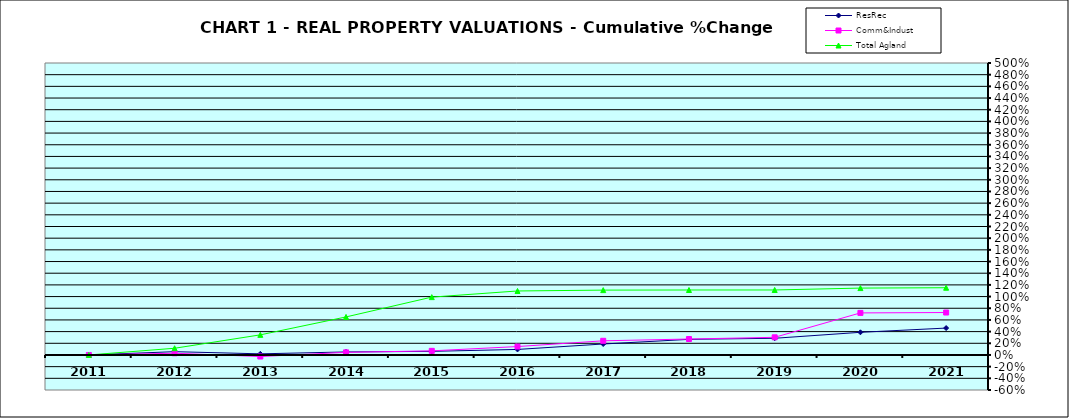
| Category | ResRec | Comm&Indust | Total Agland |
|---|---|---|---|
| 2011.0 | 0 | 0 | 0 |
| 2012.0 | 0.056 | 0.029 | 0.115 |
| 2013.0 | 0.019 | -0.027 | 0.345 |
| 2014.0 | 0.052 | 0.045 | 0.651 |
| 2015.0 | 0.062 | 0.071 | 0.991 |
| 2016.0 | 0.094 | 0.144 | 1.096 |
| 2017.0 | 0.188 | 0.242 | 1.111 |
| 2018.0 | 0.267 | 0.273 | 1.113 |
| 2019.0 | 0.286 | 0.302 | 1.113 |
| 2020.0 | 0.388 | 0.72 | 1.145 |
| 2021.0 | 0.461 | 0.727 | 1.152 |